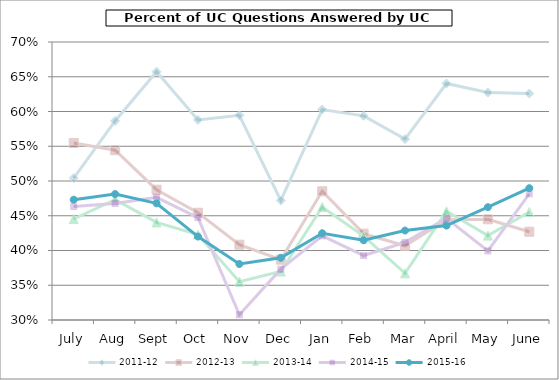
| Category | 2011-12 | 2012-13 | 2013-14 | 2014-15 | 2015-16 |
|---|---|---|---|---|---|
| July | 0.504 | 0.555 | 0.445 | 0.463 | 0.473 |
| Aug | 0.586 | 0.544 | 0.473 | 0.468 | 0.481 |
| Sept | 0.657 | 0.487 | 0.44 | 0.476 | 0.468 |
| Oct | 0.588 | 0.454 | 0.423 | 0.447 | 0.42 |
| Nov | 0.594 | 0.408 | 0.355 | 0.308 | 0.381 |
| Dec | 0.472 | 0.387 | 0.37 | 0.373 | 0.389 |
| Jan | 0.603 | 0.485 | 0.463 | 0.421 | 0.425 |
| Feb | 0.594 | 0.424 | 0.421 | 0.393 | 0.415 |
| Mar | 0.56 | 0.407 | 0.367 | 0.412 | 0.429 |
| April | 0.64 | 0.444 | 0.456 | 0.446 | 0.436 |
| May | 0.627 | 0.445 | 0.421 | 0.399 | 0.462 |
| June | 0.626 | 0.427 | 0.455 | 0.482 | 0.49 |